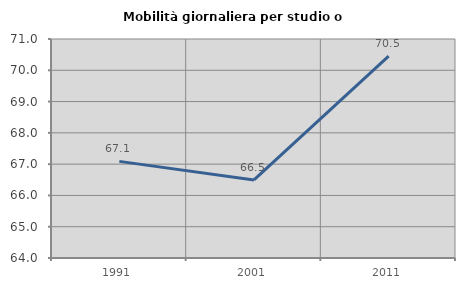
| Category | Mobilità giornaliera per studio o lavoro |
|---|---|
| 1991.0 | 67.088 |
| 2001.0 | 66.496 |
| 2011.0 | 70.454 |